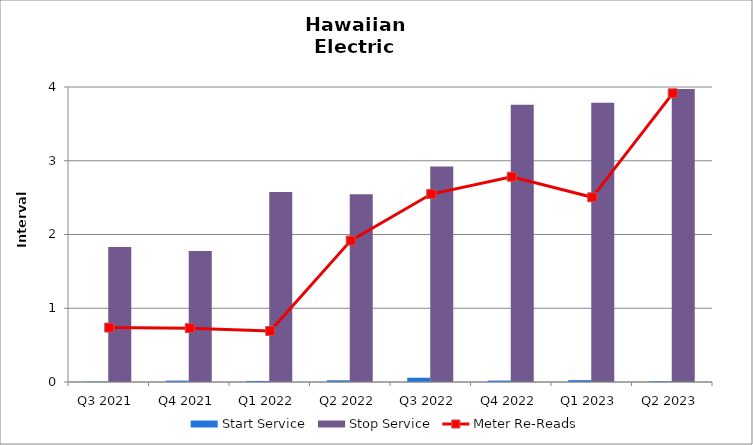
| Category | Start Service | Stop Service |
|---|---|---|
| Q3 2021 | 0.005 | 1.831 |
| Q4 2021 | 0.019 | 1.776 |
| Q1 2022 | 0.014 | 2.575 |
| Q2 2022 | 0.023 | 2.546 |
| Q3 2022 | 0.058 | 2.921 |
| Q4 2022 | 0.02 | 3.758 |
| Q1 2023 | 0.025 | 3.786 |
| Q2 2023 | 0.01 | 3.972 |